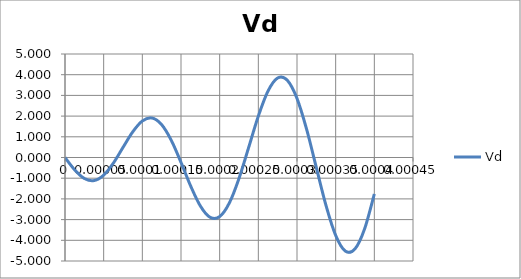
| Category | Vd |
|---|---|
| 0.0 | 0 |
| 1.25e-05 | -0.597 |
| 2.5e-05 | -1.013 |
| 3.7500000000000003e-05 | -1.115 |
| 5e-05 | -0.853 |
| 6.25e-05 | -0.274 |
| 7.500000000000001e-05 | 0.487 |
| 8.75e-05 | 1.235 |
| 0.0001 | 1.763 |
| 0.00011250000000000001 | 1.908 |
| 0.000125 | 1.586 |
| 0.0001375 | 0.825 |
| 0.00015000000000000001 | -0.237 |
| 0.00016250000000000002 | -1.378 |
| 0.000175 | -2.341 |
| 0.0001875 | -2.887 |
| 0.0002 | -2.853 |
| 0.00021250000000000002 | -2.198 |
| 0.00022500000000000002 | -1.013 |
| 0.0002375 | 0.486 |
| 0.00025 | 2 |
| 0.00026250000000000004 | 3.21 |
| 0.000275 | 3.841 |
| 0.0002875 | 3.728 |
| 0.00030000000000000003 | 2.853 |
| 0.0003125 | 1.356 |
| 0.00032500000000000004 | -0.487 |
| 0.0003375 | -2.317 |
| 0.00035 | -3.763 |
| 0.00036250000000000003 | -4.521 |
| 0.000375 | -4.414 |
| 0.00038750000000000004 | -3.438 |
| 0.0004 | -1.763 |